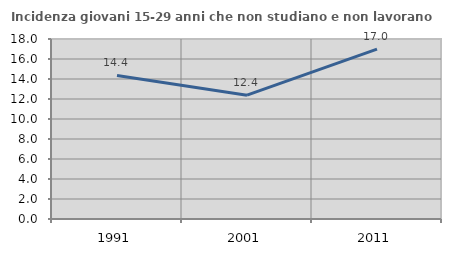
| Category | Incidenza giovani 15-29 anni che non studiano e non lavorano  |
|---|---|
| 1991.0 | 14.361 |
| 2001.0 | 12.386 |
| 2011.0 | 16.989 |